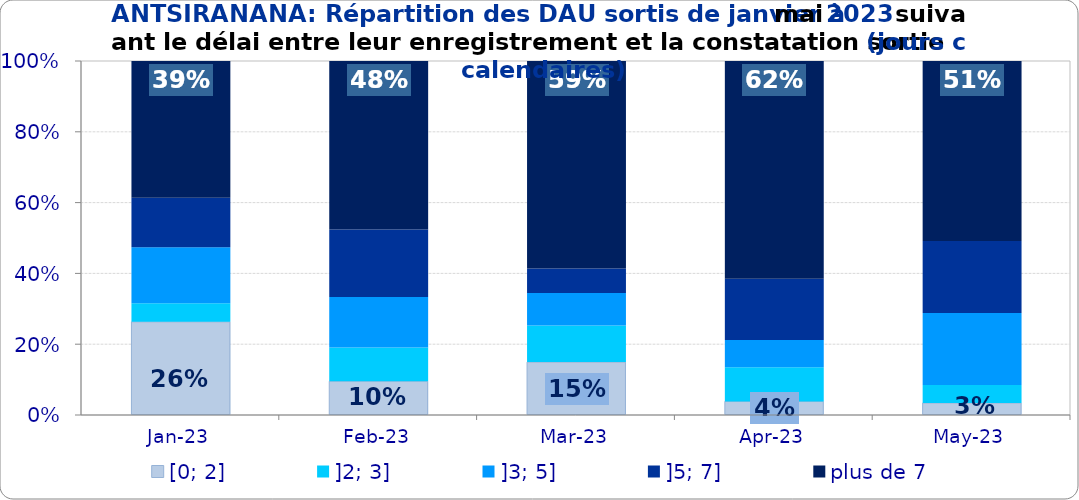
| Category | [0; 2] | ]2; 3] | ]3; 5] | ]5; 7] | plus de 7 |
|---|---|---|---|---|---|
| 2023-01-01 | 0.263 | 0.053 | 0.158 | 0.14 | 0.386 |
| 2023-02-01 | 0.095 | 0.095 | 0.143 | 0.19 | 0.476 |
| 2023-03-01 | 0.149 | 0.103 | 0.092 | 0.069 | 0.586 |
| 2023-04-01 | 0.038 | 0.096 | 0.077 | 0.173 | 0.615 |
| 2023-05-01 | 0.034 | 0.051 | 0.203 | 0.203 | 0.508 |